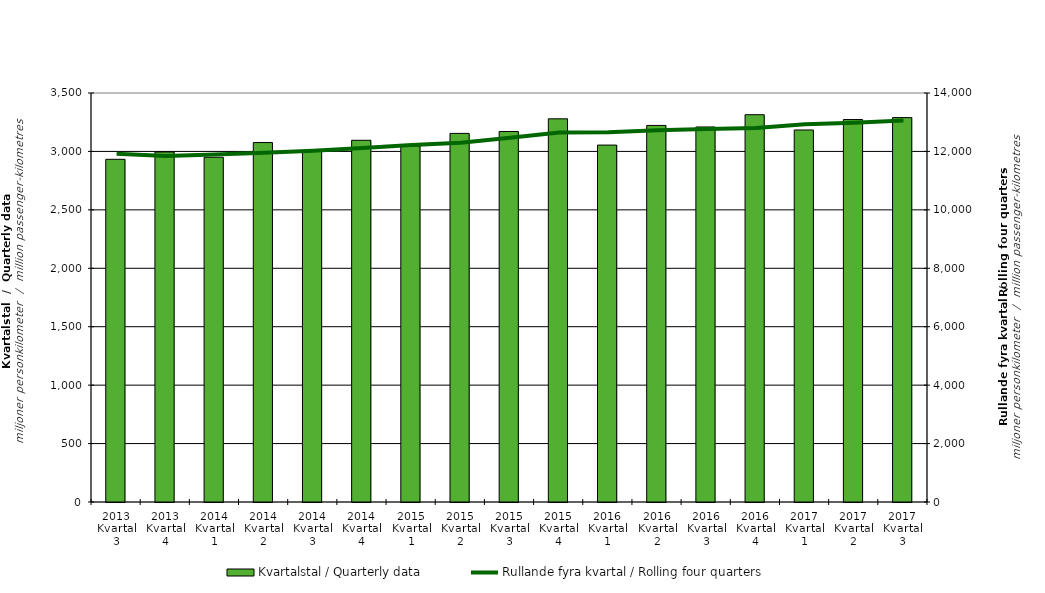
| Category | Kvartalstal / Quarterly data |
|---|---|
| 2013 Kvartal 3 | 2932.563 |
| 2013 Kvartal 4 | 2995.246 |
| 2014 Kvartal 1 | 2950.13 |
| 2014 Kvartal 2 | 3075.752 |
| 2014 Kvartal 3 | 2999.774 |
| 2014 Kvartal 4 | 3095.522 |
| 2015 Kvartal 1 | 3046.219 |
| 2015 Kvartal 2 | 3154.23 |
| 2015 Kvartal 3 | 3170.433 |
| 2015 Kvartal 4 | 3279.061 |
| 2016 Kvartal 1 | 3054.329 |
| 2016 Kvartal 2 | 3222.51 |
| 2016 Kvartal 3 | 3209.228 |
| 2016 Kvartal 4 | 3314.245 |
| 2017 Kvartal 1 | 3183.54 |
| 2017 Kvartal 2 | 3272.798 |
| 2017 Kvartal 3 | 3289.423 |